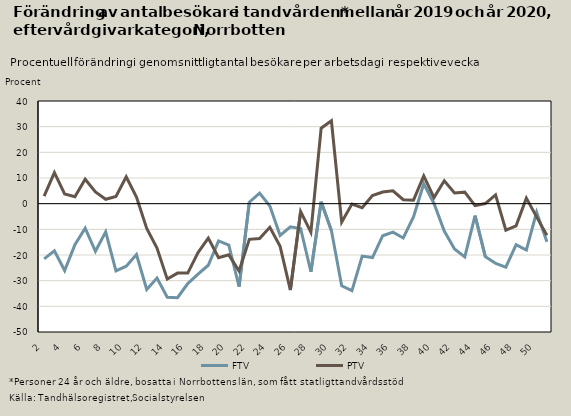
| Category | FTV | PTV |
|---|---|---|
| 2.0 | -21.522 | 2.922 |
| 3.0 | -18.391 | 12.102 |
| 4.0 | -26.055 | 3.793 |
| 5.0 | -15.959 | 2.707 |
| 6.0 | -9.535 | 9.532 |
| 7.0 | -18.534 | 4.542 |
| 8.0 | -10.986 | 1.693 |
| 9.0 | -26.188 | 2.778 |
| 10.0 | -24.376 | 10.485 |
| 11.0 | -19.82 | 2.566 |
| 12.0 | -33.407 | -9.666 |
| 13.0 | -28.955 | -17.263 |
| 14.0 | -36.439 | -29.395 |
| 15.0 | -36.629 | -27.05 |
| 16.0 | -31.142 | -27.04 |
| 17.0 | -27.493 | -19.043 |
| 18.0 | -23.99 | -13.444 |
| 19.0 | -14.496 | -21.088 |
| 20.0 | -16.125 | -19.949 |
| 21.0 | -32.371 | -26.23 |
| 22.0 | 0.578 | -13.882 |
| 23.0 | 4.122 | -13.572 |
| 24.0 | -0.921 | -9.179 |
| 25.0 | -12.404 | -16.608 |
| 26.0 | -9.034 | -33.65 |
| 27.0 | -9.677 | -3.12 |
| 28.0 | -26.526 | -11.128 |
| 29.0 | 0.763 | 29.412 |
| 30.0 | -10.485 | 32.273 |
| 31.0 | -31.975 | -7.234 |
| 32.0 | -33.858 | -0.145 |
| 33.0 | -20.415 | -1.546 |
| 34.0 | -20.981 | 3.181 |
| 35.0 | -12.492 | 4.554 |
| 36.0 | -11.104 | 5.026 |
| 37.0 | -13.361 | 1.552 |
| 38.0 | -5.188 | 1.359 |
| 39.0 | 7.766 | 10.817 |
| 40.0 | 0.078 | 2.391 |
| 41.0 | -10.661 | 8.927 |
| 42.0 | -17.651 | 4.167 |
| 43.0 | -20.755 | 4.492 |
| 44.0 | -4.649 | -0.772 |
| 45.0 | -20.643 | 0.04 |
| 46.0 | -23.25 | 3.423 |
| 47.0 | -24.756 | -10.308 |
| 48.0 | -15.992 | -8.658 |
| 49.0 | -18.069 | 2.153 |
| 50.0 | -3.316 | -5.136 |
| 51.0 | -14.833 | -12.324 |